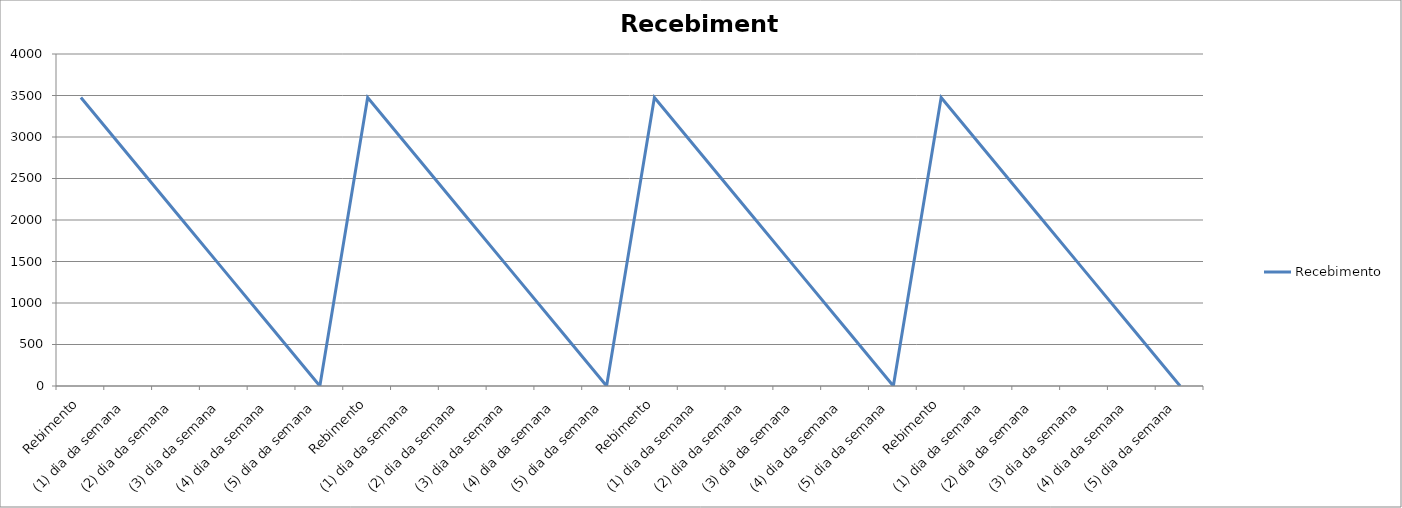
| Category | Recebimento |
|---|---|
| Rebimento | 3475 |
| (1) dia da semana | 2780 |
| (2) dia da semana | 2085 |
| (3) dia da semana | 1390 |
| (4) dia da semana | 695 |
| (5) dia da semana | 0 |
| Rebimento | 3475 |
| (1) dia da semana | 2780 |
| (2) dia da semana | 2085 |
| (3) dia da semana | 1390 |
| (4) dia da semana | 695 |
| (5) dia da semana | 0 |
| Rebimento | 3475 |
| (1) dia da semana | 2780 |
| (2) dia da semana | 2085 |
| (3) dia da semana | 1390 |
| (4) dia da semana | 695 |
| (5) dia da semana | 0 |
| Rebimento | 3475 |
| (1) dia da semana | 2780 |
| (2) dia da semana | 2085 |
| (3) dia da semana | 1390 |
| (4) dia da semana | 695 |
| (5) dia da semana | 0 |